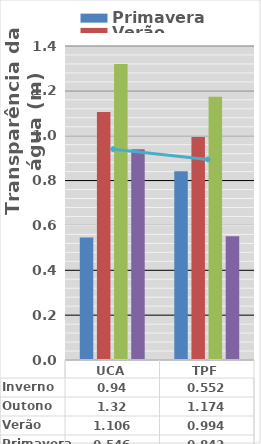
| Category | Primavera | Verão | Outono | Inverno |
|---|---|---|---|---|
| UCA | 0.546 | 1.106 | 1.32 | 0.94 |
| TPF | 0.842 | 0.994 | 1.174 | 0.552 |